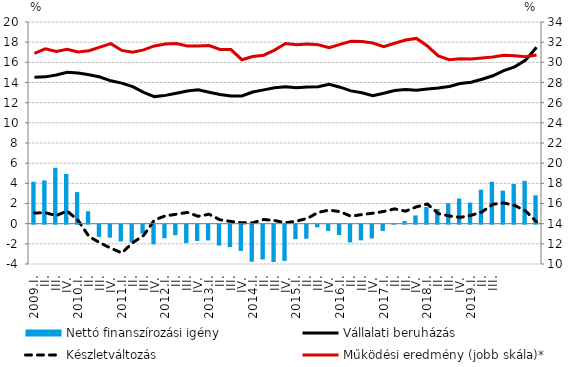
| Category | Nettó finanszírozási igény |
|---|---|
| 2009.I. | 4.156 |
| II. | 4.29 |
| III. | 5.545 |
| IV. | 4.935 |
| 2010.I. | 3.13 |
| II. | 1.236 |
| III. | -1.214 |
| IV. | -1.287 |
| 2011.I. | -1.668 |
| II. | -1.744 |
| III. | -0.885 |
| IV. | -1.945 |
| 2012.I. | -1.349 |
| II. | -1.042 |
| III. | -1.828 |
| IV. | -1.616 |
| 2013.I. | -1.564 |
| II. | -2.071 |
| III. | -2.225 |
| IV. | -2.613 |
| 2014.I. | -3.675 |
| II. | -3.449 |
| III. | -3.702 |
| IV. | -3.595 |
| 2015.I. | -1.437 |
| II. | -1.392 |
| III. | -0.265 |
| IV. | -0.615 |
| 2016.I. | -1.029 |
| II. | -1.762 |
| III. | -1.557 |
| IV. | -1.361 |
| 2017.I. | -0.624 |
| II. | 0.028 |
| III. | 0.259 |
| IV. | 0.812 |
| 2018.I. | 1.642 |
| II. | 1.461 |
| III. | 2.03 |
| IV. | 2.491 |
| 2019.I. | 2.092 |
| II. | 3.366 |
| III. | 4.157 |